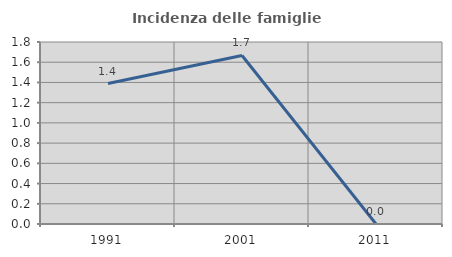
| Category | Incidenza delle famiglie numerose |
|---|---|
| 1991.0 | 1.389 |
| 2001.0 | 1.667 |
| 2011.0 | 0 |